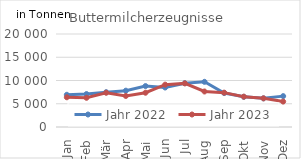
| Category | Jahr 2022 | Jahr 2023 |
|---|---|---|
| Jan | 6926.617 | 6391.688 |
| Feb | 7082.187 | 6279.419 |
| Mär | 7486.319 | 7363.626 |
| Apr | 7809.44 | 6677.913 |
| Mai | 8800.816 | 7369.554 |
| Jun | 8493.559 | 9103.536 |
| Jul | 9423.987 | 9380.768 |
| Aug | 9717.579 | 7634.807 |
| Sep | 7301.763 | 7388.197 |
| Okt | 6485.591 | 6526.408 |
| Nov | 6160.829 | 6165.22 |
| Dez | 6640.947 | 5467.887 |